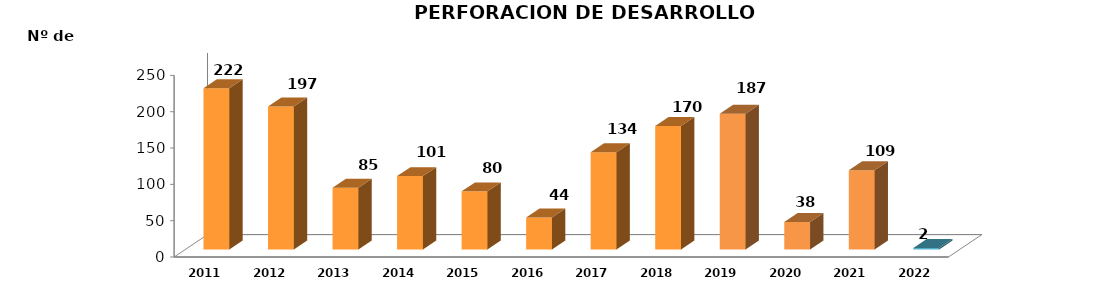
| Category | Series 0 |
|---|---|
| 2011.0 | 222 |
| 2012.0 | 197 |
| 2013.0 | 85 |
| 2014.0 | 101 |
| 2015.0 | 80 |
| 2016.0 | 44 |
| 2017.0 | 134 |
| 2018.0 | 170 |
| 2019.0 | 187 |
| 2020.0 | 38 |
| 2021.0 | 109 |
| 2022.0 | 2 |